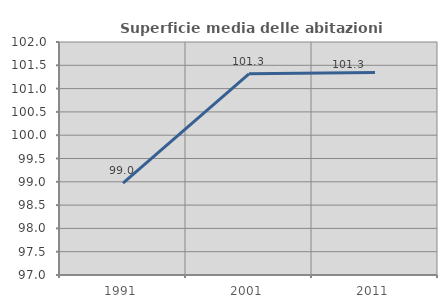
| Category | Superficie media delle abitazioni occupate |
|---|---|
| 1991.0 | 98.971 |
| 2001.0 | 101.317 |
| 2011.0 | 101.346 |